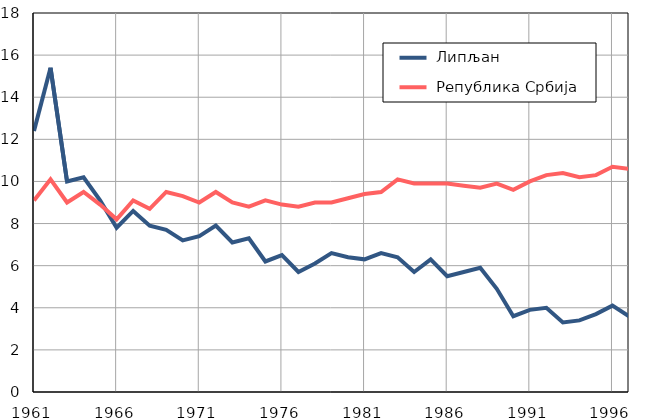
| Category |  Липљан |  Република Србија |
|---|---|---|
| 1961.0 | 12.4 | 9.1 |
| 1962.0 | 15.4 | 10.1 |
| 1963.0 | 10 | 9 |
| 1964.0 | 10.2 | 9.5 |
| 1965.0 | 9.1 | 8.9 |
| 1966.0 | 7.8 | 8.2 |
| 1967.0 | 8.6 | 9.1 |
| 1968.0 | 7.9 | 8.7 |
| 1969.0 | 7.7 | 9.5 |
| 1970.0 | 7.2 | 9.3 |
| 1971.0 | 7.4 | 9 |
| 1972.0 | 7.9 | 9.5 |
| 1973.0 | 7.1 | 9 |
| 1974.0 | 7.3 | 8.8 |
| 1975.0 | 6.2 | 9.1 |
| 1976.0 | 6.5 | 8.9 |
| 1977.0 | 5.7 | 8.8 |
| 1978.0 | 6.1 | 9 |
| 1979.0 | 6.6 | 9 |
| 1980.0 | 6.4 | 9.2 |
| 1981.0 | 6.3 | 9.4 |
| 1982.0 | 6.6 | 9.5 |
| 1983.0 | 6.4 | 10.1 |
| 1984.0 | 5.7 | 9.9 |
| 1985.0 | 6.3 | 9.9 |
| 1986.0 | 5.5 | 9.9 |
| 1987.0 | 5.7 | 9.8 |
| 1988.0 | 5.9 | 9.7 |
| 1989.0 | 4.9 | 9.9 |
| 1990.0 | 3.6 | 9.6 |
| 1991.0 | 3.9 | 10 |
| 1992.0 | 4 | 10.3 |
| 1993.0 | 3.3 | 10.4 |
| 1994.0 | 3.4 | 10.2 |
| 1995.0 | 3.7 | 10.3 |
| 1996.0 | 4.1 | 10.7 |
| 1997.0 | 3.6 | 10.6 |